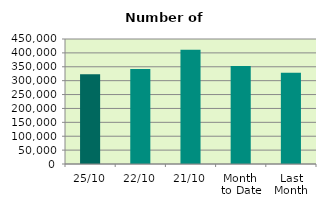
| Category | Series 0 |
|---|---|
| 25/10 | 323134 |
| 22/10 | 342032 |
| 21/10 | 410926 |
| Month 
to Date | 352801.647 |
| Last
Month | 328669.364 |